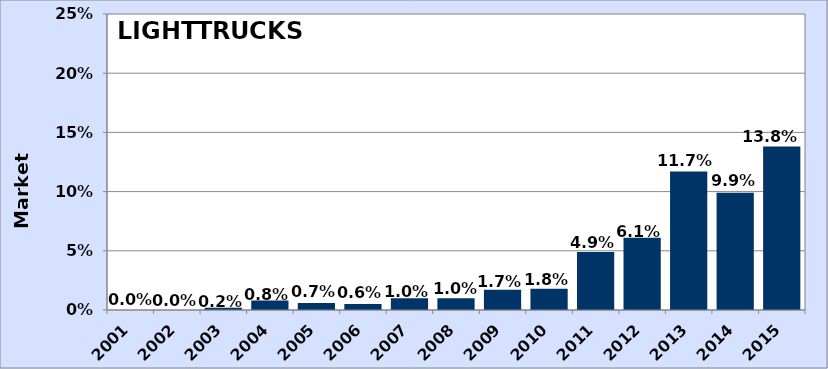
| Category | Series 0 |
|---|---|
| 2001.0 | 0 |
| 2002.0 | 0 |
| 2003.0 | 0.002 |
| 2004.0 | 0.008 |
| 2005.0 | 0.007 |
| 2006.0 | 0.006 |
| 2007.0 | 0.01 |
| 2008.0 | 0.01 |
| 2009.0 | 0.017 |
| 2010.0 | 0.018 |
| 2011.0 | 0.049 |
| 2012.0 | 0.061 |
| 2013.0 | 0.117 |
| 2014.0 | 0.099 |
| 2015.0 | 0.138 |